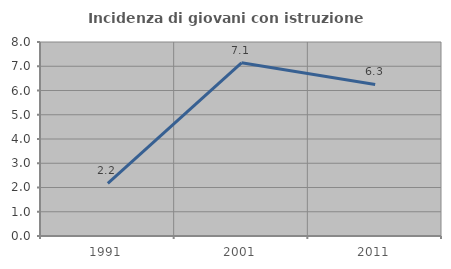
| Category | Incidenza di giovani con istruzione universitaria |
|---|---|
| 1991.0 | 2.174 |
| 2001.0 | 7.143 |
| 2011.0 | 6.25 |